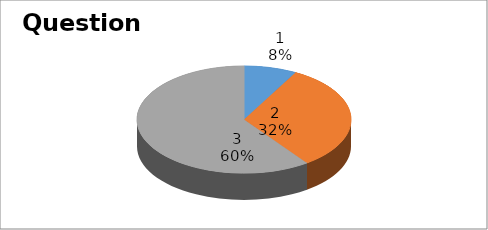
| Category | Series 0 |
|---|---|
| 0 | 2 |
| 1 | 8 |
| 2 | 15 |